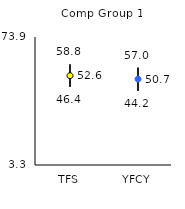
| Category | 25th | 75th | Mean |
|---|---|---|---|
| TFS | 46.4 | 58.8 | 52.55 |
| YFCY | 44.2 | 57 | 50.66 |